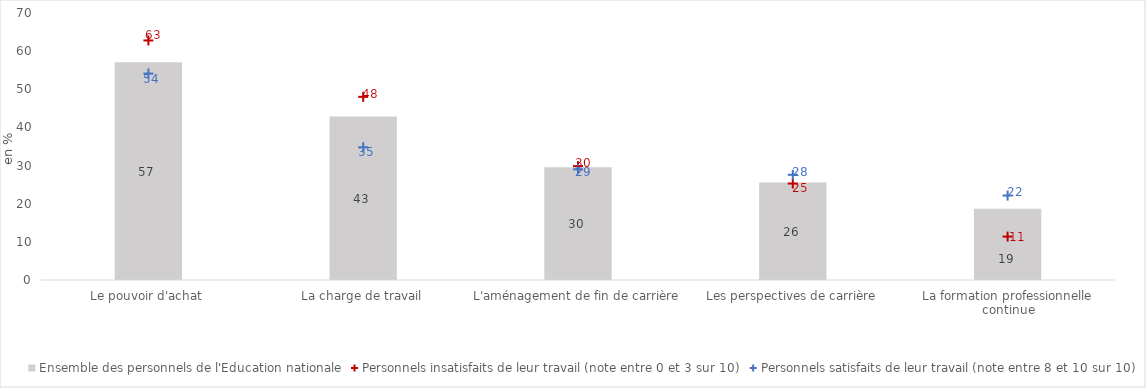
| Category | Ensemble des personnels de l'Education nationale |
|---|---|
| Le pouvoir d'achat | 57.08 |
| La charge de travail | 42.85 |
| L'aménagement de fin de carrière | 29.55 |
| Les perspectives de carrière | 25.54 |
| La formation professionnelle continue | 18.67 |